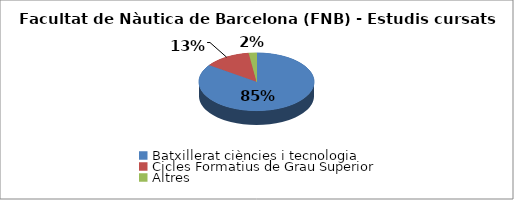
| Category | Facultat de Nàutica de Barcelona (FNB) - Estudis cursats |
|---|---|
| Batxillerat ciències i tecnologia | 0.848 |
| Cicles Formatius de Grau Superior | 0.13 |
| Altres | 0.022 |